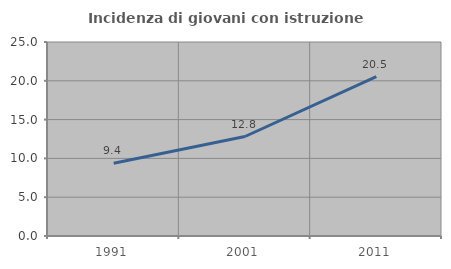
| Category | Incidenza di giovani con istruzione universitaria |
|---|---|
| 1991.0 | 9.383 |
| 2001.0 | 12.822 |
| 2011.0 | 20.524 |